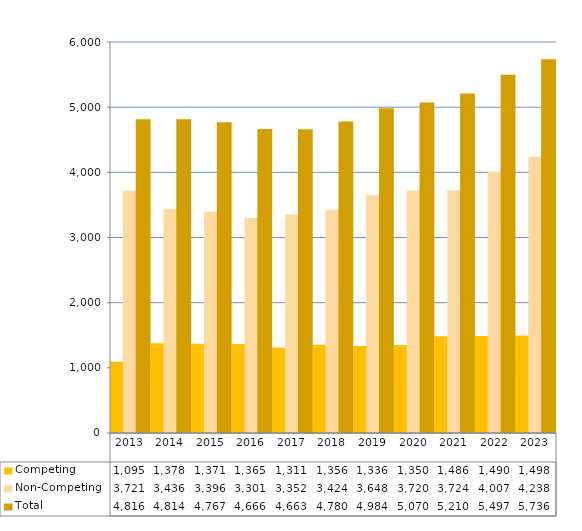
| Category | Competing  | Non-Competing    | Total |
|---|---|---|---|
| 2013.0 | 1095 | 3721 | 4816 |
| 2014.0 | 1378 | 3436 | 4814 |
| 2015.0 | 1371 | 3396 | 4767 |
| 2016.0 | 1365 | 3301 | 4666 |
| 2017.0 | 1311 | 3352 | 4663 |
| 2018.0 | 1356 | 3424 | 4780 |
| 2019.0 | 1336 | 3648 | 4984 |
| 2020.0 | 1350 | 3720 | 5070 |
| 2021.0 | 1486 | 3724 | 5210 |
| 2022.0 | 1490 | 4007 | 5497 |
| 2023.0 | 1498 | 4238 | 5736 |